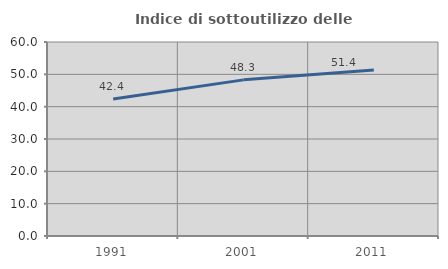
| Category | Indice di sottoutilizzo delle abitazioni  |
|---|---|
| 1991.0 | 42.39 |
| 2001.0 | 48.289 |
| 2011.0 | 51.363 |